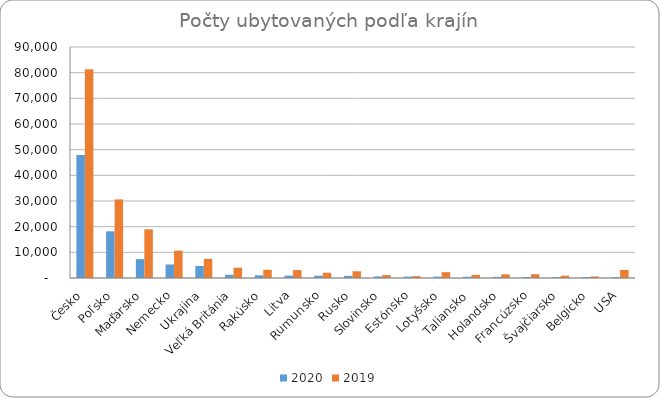
| Category | 2020 | 2019 |
|---|---|---|
| Česko | 47917 | 81302 |
| Poľsko | 18189 | 30628 |
| Maďarsko | 7348 | 18984 |
| Nemecko | 5269 | 10658 |
| Ukrajina | 4695 | 7450 |
| Veľká Británia | 1259 | 4018 |
| Rakúsko | 1035 | 3205 |
| Litva | 935 | 3095 |
| Rumunsko | 905 | 2047 |
| Rusko | 833 | 2626 |
| Slovinsko | 614 | 1137 |
| Estónsko | 554 | 752 |
| Lotyšsko | 528 | 2276 |
| Taliansko | 482 | 1211 |
| Holandsko | 437 | 1453 |
| Francúzsko | 375 | 1487 |
| Švajčiarsko | 342 | 904 |
| Belgicko | 335 | 624 |
| USA | 312 | 3139 |